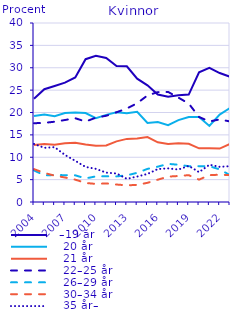
| Category |   –19 år |    20 år |    21 år |    22–25 år |    26–29 år |    30–34 år |    35 år– |
|---|---|---|---|---|---|---|---|
| 2004.0 | 23.055 | 19.228 | 12.728 | 17.602 | 7.059 | 7.352 | 12.976 |
| 2005.0 | 25.214 | 19.563 | 12.978 | 17.688 | 5.956 | 6.498 | 12.103 |
| 2006.0 | 25.916 | 19.168 | 12.8 | 17.94 | 6.027 | 5.885 | 12.264 |
| 2007.0 | 26.672 | 19.876 | 13.138 | 18.321 | 5.996 | 5.475 | 10.522 |
| 2008.0 | 27.845 | 20.02 | 13.257 | 18.72 | 5.959 | 4.993 | 9.206 |
| 2009.0 | 31.913 | 19.89 | 12.858 | 17.972 | 5.273 | 4.261 | 7.832 |
| 2010.0 | 32.66 | 18.752 | 12.569 | 18.849 | 5.725 | 4.036 | 7.408 |
| 2011.0 | 32.179 | 19.463 | 12.623 | 19.269 | 5.751 | 4.153 | 6.562 |
| 2012.0 | 30.364 | 20.037 | 13.554 | 20.049 | 5.719 | 3.902 | 6.374 |
| 2013.0 | 30.316 | 19.817 | 14.102 | 20.898 | 5.959 | 3.729 | 5.18 |
| 2014.0 | 27.556 | 20.171 | 14.177 | 22.069 | 6.523 | 3.818 | 5.685 |
| 2015.0 | 26.064 | 17.662 | 14.502 | 23.817 | 7.399 | 4.287 | 6.269 |
| 2016.0 | 24.007 | 17.87 | 13.327 | 24.551 | 7.897 | 4.986 | 7.362 |
| 2017.0 | 23.532 | 17.177 | 12.986 | 24.595 | 8.523 | 5.672 | 7.516 |
| 2018.0 | 23.875 | 18.292 | 13.122 | 23.322 | 8.325 | 5.813 | 7.252 |
| 2019.0 | 24 | 19 | 13 | 22 | 8 | 6 | 8.072 |
| 2020.0 | 29 | 19 | 12 | 19 | 8 | 5 | 6.664 |
| 2021.0 | 30 | 17 | 12 | 18 | 8 | 6 | 8.328 |
| 2022.0 | 28.822 | 19.544 | 11.944 | 18.446 | 7.286 | 6.098 | 7.861 |
| 2023.0 | 28 | 21 | 13 | 18 | 6 | 6 | 8 |